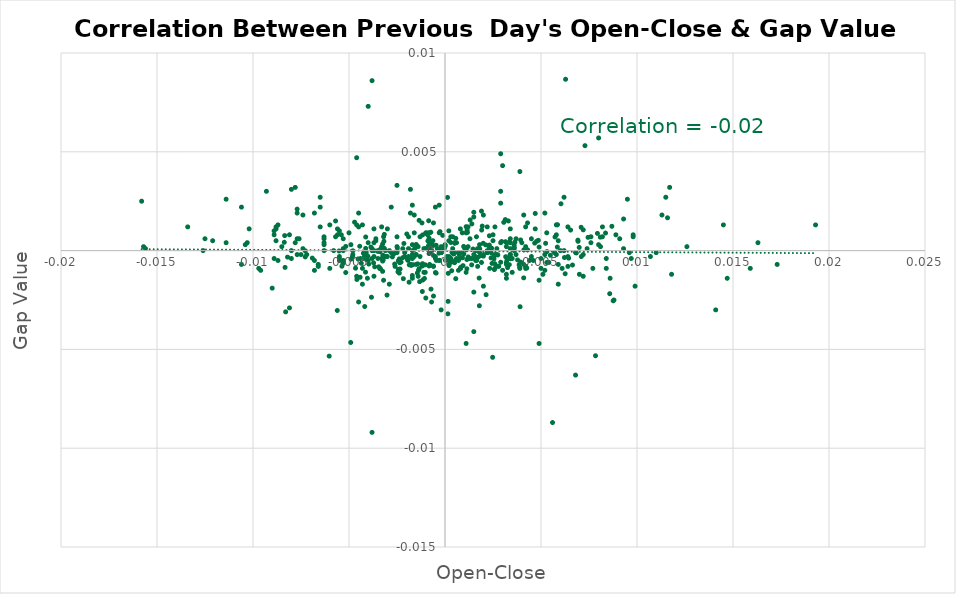
| Category | Series 0 |
|---|---|
| 2.0000000000020002e-05 | 0 |
| -0.004529999999998924 | 0 |
| -0.0015200000000000768 | 0 |
| 0.00034999999999896225 | -0.001 |
| 0.006839999999999957 | 0 |
| 0.0017099999999999893 | 0 |
| 0.008090000000000042 | 0.001 |
| -0.008329999999999949 | -0.001 |
| 0.0009799999999999809 | 0 |
| -0.0008599999999999719 | 0 |
| -0.0019399999999989426 | 0 |
| 0.0009700000000000264 | 0 |
| 0.004769999999999941 | 0 |
| 0.0010999999999999899 | 0.001 |
| -0.005369999999999986 | -0.001 |
| -0.003249999999998976 | 0 |
| 0.0042999999999999705 | 0 |
| -0.003249999999999975 | -0.001 |
| -0.00046000000000001595 | 0 |
| 0.004669999999999952 | 0 |
| 0.006919999999999926 | 0.001 |
| -0.0046599999999999975 | -0.001 |
| 0.003390000000000004 | 0 |
| 0.0025800000000000267 | 0 |
| -0.0006099999999999994 | 0 |
| -0.00011999999999889877 | 0.001 |
| 0.0010299999999999754 | 0 |
| -0.0008500000000000174 | 0.002 |
| -0.005319999999999991 | -0.001 |
| -0.0030200000000000227 | -0.002 |
| -0.004250000000001086 | 0 |
| -0.0011700000000000044 | -0.001 |
| -0.0024300000000000432 | -0.001 |
| 0.0049000000000000155 | 0 |
| -0.0026199999999999557 | -0.001 |
| -0.0007099999999999884 | 0 |
| -0.003449999999999953 | -0.001 |
| -0.0008299999999999974 | 0 |
| -0.004039999999998933 | -0.001 |
| -0.00383 | -0.002 |
| 0.0014999999999999458 | 0.002 |
| -0.0041400000000000325 | -0.001 |
| -0.0004999999999999449 | -0.001 |
| 0.001849999999998908 | 0 |
| -0.0008400000000000629 | 0 |
| 0.0017300000000000093 | 0 |
| 0.0040999999999999925 | -0.001 |
| -0.0008299999999999974 | 0 |
| 0.002950000000000008 | 0 |
| -0.0010299999999999754 | -0.001 |
| 0.007090000000000041 | 0.001 |
| -0.0016999999999999238 | -0.001 |
| -0.002429999999999932 | -0.001 |
| -0.0033599999999989194 | -0.001 |
| 0.001540000000001096 | 0 |
| -0.004890000000000061 | 0 |
| 0.003939999999998944 | 0.001 |
| -0.0044399999999999995 | 0 |
| 0.00048000000000003595 | 0 |
| -0.0034999999999999476 | 0 |
| -0.0048000000000000265 | 0 |
| 0.0048599999999999755 | 0.001 |
| 0.00653999999999999 | 0.001 |
| -0.0011900000000000244 | -0.001 |
| 0.0011700000000000044 | 0.001 |
| 0.00031999999999998696 | -0.001 |
| -0.0013400000000000079 | -0.001 |
| -0.00835000000000008 | 0.001 |
| -0.007279999999999953 | 0 |
| 0.0023299999999999432 | 0 |
| -0.0008099999999999774 | 0 |
| 0.0011099999999999444 | 0 |
| 0.0019400000000000528 | 0.001 |
| 0.003610000000000002 | 0 |
| 0.0025500000000000522 | 0 |
| 0.003149999999999986 | 0 |
| 0.0008099999999999774 | 0 |
| -0.0031599999999989414 | 0.001 |
| 0.01158999999999999 | 0.002 |
| 0.0025900000000000922 | -0.001 |
| -0.00490999999999997 | -0.005 |
| 0.007839999999999958 | -0.005 |
| 0.0021400000000000308 | -0.002 |
| 0.005859999999999976 | 0.001 |
| -0.003660000000001107 | -0.001 |
| -0.0032200000000000006 | 0 |
| 0.005240000000000022 | 0 |
| -0.0023800000000000487 | -0.001 |
| -0.003249999999999975 | -0.001 |
| 0.00020999999999993246 | -0.001 |
| -0.0011600000000000499 | -0.001 |
| 0.006220000000000003 | 0 |
| -0.005170000000001007 | -0.001 |
| -0.0013800000000000479 | -0.001 |
| -0.0031799999999999606 | 0 |
| -0.0014499999999999513 | 0 |
| -0.004130000000001077 | 0.001 |
| -0.0017600000000000948 | -0.001 |
| -0.0023400000000000087 | -0.001 |
| 0.0014600000000000168 | 0 |
| -0.002569999999999961 | 0 |
| 0.0036399999999999766 | 0 |
| 0.00029999999999996696 | 0 |
| 0.0037800000000000056 | 0 |
| 0.002429999999999932 | 0 |
| 0.0023100000000010334 | 0.001 |
| 0.000160000000000049 | -0.003 |
| -0.0021999999999999797 | 0 |
| -0.003390000000000004 | 0 |
| 0.00875999999999999 | -0.003 |
| -0.0022900000000000142 | -0.001 |
| 0.0021200000000000108 | 0 |
| 0.007940000000000058 | 0.001 |
| -0.00266999999999995 | 0 |
| -0.000260000000000038 | 0.001 |
| 0.00600999999999996 | 0 |
| -0.006909999999999972 | 0 |
| 0.00012999999999996348 | 0.003 |
| 0.005310000000000037 | 0 |
| -0.0048200000000000465 | 0 |
| 0.0031399999999989214 | 0.002 |
| 0.006990000000000052 | 0 |
| 0.0016100000000001113 | 0 |
| -0.001180000000000181 | -0.001 |
| 0.0032600000000000406 | -0.001 |
| 0.0023299999999999432 | -0.001 |
| 0.00031999999999987594 | -0.001 |
| 0.001140000000000141 | -0.001 |
| 0.0005199999999998539 | -0.001 |
| -0.0008299999999998864 | -0.001 |
| -0.00045000000000106066 | -0.001 |
| -0.0011700000000000044 | 0.001 |
| 0.0018100000000000893 | 0 |
| 0.003230000000000066 | 0 |
| -0.0010700000000000154 | -0.001 |
| 0.00017000000000000348 | -0.001 |
| -0.00028999999999990145 | 0 |
| 0.0020000000000000018 | 0 |
| -0.0021700000000000053 | -0.001 |
| 0.0028999999999999027 | -0.001 |
| -0.0014399999999999968 | -0.001 |
| 0.0005099999999989002 | 0 |
| 0.00043999999999999595 | 0 |
| 0.0038599999999999746 | -0.001 |
| -0.007280000000000064 | 0 |
| -0.0041800000000000725 | -0.003 |
| 0.0019900000000000473 | 0 |
| -0.0040200000000000236 | 0 |
| -0.0023999999999999577 | -0.001 |
| 0.006440000000000001 | 0 |
| 0.0004999999999999449 | -0.001 |
| -0.000600000000000156 | 0 |
| 0.00275000000000003 | 0 |
| -0.00046000000000001595 | -0.001 |
| -0.0018699999999999273 | -0.002 |
| -0.00029999999999996696 | 0 |
| -0.0044199999999999795 | -0.001 |
| 0.0011499999999999844 | 0.001 |
| -0.0015800000000000258 | 0 |
| -0.003970000000000029 | -0.001 |
| 0.0005600000000000049 | 0.001 |
| 0.0025700000000010714 | -0.001 |
| 0.0013900000000000023 | -0.001 |
| -0.0016700000000000603 | -0.001 |
| 0.0011399999999999189 | 0 |
| -0.0006099999999999994 | -0.001 |
| 0.006639999999999979 | -0.001 |
| 0.0007500000000000284 | 0 |
| 0.003350000000000075 | -0.001 |
| 0.007449999999999957 | 0.001 |
| 0.004109999999999947 | 0 |
| -0.0007300000000000084 | -0.002 |
| -0.004589999999999983 | -0.001 |
| -0.0021399999999999197 | 0 |
| 0.0014000000000000679 | 0.001 |
| 0.003889999999999949 | -0.001 |
| 0.0024500000000000632 | -0.001 |
| -0.0024799999999999267 | 0 |
| 0.0012099999999999334 | 0 |
| -0.003489999999999993 | 0 |
| 0.00036000000000002697 | 0 |
| 0.0042600000000000415 | -0.001 |
| 0.00268999999999997 | -0.001 |
| 0.00164999999999893 | -0.001 |
| -0.0006300000000000194 | 0.001 |
| -0.00031000000000003247 | 0 |
| 0.003909999999999969 | -0.003 |
| -0.0032399999999989104 | 0 |
| -0.005170000000000008 | 0 |
| -0.0033600000000000296 | 0 |
| -0.004709999999999992 | 0.001 |
| 0.006929999999999992 | 0 |
| -0.005609999999998894 | -0.003 |
| 0.008360000000000034 | 0.001 |
| -0.0008899999999999464 | 0 |
| -0.0013199999999999878 | -0.002 |
| 0.0016399999999999748 | 0.001 |
| 0.007289999999999908 | 0.005 |
| 0.0024000000000000687 | 0 |
| 0.005489999999999995 | 0 |
| -0.002360000000001028 | -0.001 |
| -0.0011799999999998478 | -0.002 |
| -3.999999999992898e-05 | 0 |
| -0.008369999999999989 | 0 |
| 0.0009099999999999664 | 0 |
| 0.0007499999999999174 | 0 |
| 0.0023099999999999232 | 0 |
| 0.0013099999999999223 | 0.002 |
| 0.0030600000000000627 | 0.001 |
| 0.006039999999999934 | 0.002 |
| -0.00602999999999998 | -0.005 |
| 0.008579999999998922 | -0.002 |
| -0.0023800000000000487 | 0 |
| 0.00041999999999997595 | 0 |
| -0.0043600000000000305 | -0.001 |
| -0.003860000000001085 | 0 |
| 0.005409999999998916 | -0.001 |
| 0.0031599999999999406 | 0 |
| -0.0037199999999999456 | -0.001 |
| -0.0027399999999999647 | 0 |
| 0.0025399999999999867 | 0 |
| 0.0009399999999999409 | -0.001 |
| -0.0024500000000000632 | -0.001 |
| 0.008689999999999976 | 0.001 |
| -0.001989999999998937 | 0.001 |
| 0.007199999999998985 | 0.001 |
| 0.006259999999999932 | -0.001 |
| -0.0009000000000000119 | 0.001 |
| -0.0010299999999999754 | -0.001 |
| 0.0024800000000000377 | -0.005 |
| 0.000560000000000116 | -0.001 |
| -0.004129999999999967 | 0 |
| -0.0018600000000001948 | -0.001 |
| 0.0017899999999999583 | -0.003 |
| -0.0019500000000000073 | 0 |
| 0.0008300000000001084 | -0.001 |
| 0.005730000000000013 | 0.001 |
| -0.0019200000000001438 | 0 |
| -0.005519999999999969 | 0 |
| -0.001000000000000112 | 0.001 |
| 0.00021000000000004349 | 0 |
| 0.00014999999999998348 | -0.003 |
| 0.0039399999999998325 | -0.001 |
| 0.0019099999999998563 | 0.001 |
| -0.008199999999999985 | 0 |
| 0.0046999999999999265 | 0.002 |
| -0.0014199999999999768 | -0.001 |
| 0.003409999999999913 | 0 |
| -0.0008299999999998864 | 0.001 |
| 9.999999999843467e-06 | 0 |
| 0.0017799999999998928 | -0.001 |
| -0.0031600000000000517 | 0 |
| -0.0013500000000000734 | 0.002 |
| 0.006279999999999952 | 0.009 |
| 0.005850000000000022 | 0 |
| -0.0007400000000000739 | 0.001 |
| -0.004149999999999987 | 0 |
| 0.003349999999999964 | 0 |
| -0.005299999999999971 | 0 |
| -0.0015999999999999348 | 0 |
| -0.008499999999999952 | 0 |
| -0.0029999999999988924 | 0 |
| -0.00019999999999997797 | 0 |
| -0.010399999999999965 | 0 |
| -0.006000000000000005 | 0.001 |
| 0.0006999999999989237 | -0.001 |
| -0.006800000000000028 | -0.001 |
| 0.01100000000000001 | 0 |
| -0.0009000000000000119 | 0.001 |
| -0.0014999999999999458 | 0 |
| -0.0045999999999999375 | -0.001 |
| 0.0033999999999999586 | 0.001 |
| -0.015799999999999925 | 0.003 |
| 0.005199999999999982 | 0.002 |
| 0.0003000000000010772 | 0 |
| 0.014499999999999957 | 0.001 |
| -0.00550000000000006 | -0.001 |
| 0.00040000000000006697 | 0.001 |
| -0.005300000000000082 | -0.001 |
| -0.0048000000000000265 | 0 |
| 0.006999999999998896 | -0.001 |
| -0.0036000000000000476 | 0.001 |
| -0.0010000000000000009 | -0.002 |
| 0.0019000000000000128 | -0.001 |
| 0.0037000000000000366 | 0.001 |
| -0.0017999999999989136 | -0.001 |
| -0.0024999999999999467 | 0 |
| 0.0022999999999999687 | 0 |
| -0.0010000000000000009 | 0 |
| -0.006500000000000061 | 0.001 |
| 0.0033999999999999586 | 0 |
| -0.0045000000000000595 | 0.001 |
| 0.0021999999999999797 | 0.001 |
| -0.009599999999999831 | -0.001 |
| -0.008899999999999908 | 0 |
| 0.0031999999999998696 | -0.001 |
| -0.0015000000000000568 | 0 |
| -0.0038000000000010248 | 0.009 |
| 0.0037000000000000366 | 0 |
| 0.0041999999999999815 | 0.001 |
| 0.005299999999999971 | 0.001 |
| -0.0030000000000000027 | 0.001 |
| -0.006299999999999972 | 0 |
| -0.005600000000000049 | 0.001 |
| -0.005600000000000049 | 0.001 |
| -0.010600000000000054 | -0.001 |
| 0.0014999999999999458 | -0.002 |
| -0.005700000000000038 | 0.001 |
| -0.0033999999999999586 | -0.001 |
| 0.0050000000000000044 | 0 |
| 0.005699999999999927 | 0 |
| -0.0038000000000000256 | 0 |
| -0.00880000000000003 | 0.001 |
| 0.0041999999999999815 | 0 |
| 0.0006999999999999229 | -0.001 |
| 0.0033999999999989594 | 0 |
| 0.012599999999999945 | 0 |
| 0.0 | 0 |
| -0.0029000000000000137 | -0.002 |
| 0.0043000000000000815 | 0.001 |
| -0.0038000000000000256 | 0 |
| -0.0041999999999999815 | 0 |
| 0.009499999999999953 | 0.003 |
| 0.0029000000000000137 | 0.003 |
| 0.0028999999999999027 | 0.005 |
| 0.0031999999999999806 | -0.001 |
| 0.0040999999999999925 | 0.002 |
| -0.005800000000000027 | 0 |
| 0.0035999999999999366 | 0 |
| -0.006299999999999972 | 0.001 |
| -0.0036999999999999256 | 0 |
| -0.010299999999999976 | 0 |
| -0.0005999999999999339 | 0.001 |
| 0.0008000000000000229 | 0.001 |
| 0.0039000000000000146 | -0.001 |
| -0.0017999999999999128 | 0.002 |
| 0.007200000000000095 | 0 |
| 0.0018000000000000238 | 0 |
| 0.014700000000001046 | -0.001 |
| -0.0024000000000001798 | -0.001 |
| -0.0121 | 0 |
| -0.0012999999999999678 | 0 |
| 0.011700000000000044 | 0.003 |
| -0.0015000000000000568 | -0.001 |
| -0.00550000000000006 | 0 |
| 0.0030000000000000027 | 0.004 |
| -0.009700000000000042 | -0.001 |
| -0.0032999999999999696 | 0.001 |
| 0.0041999999999999815 | -0.001 |
| -0.004000000000000115 | 0.007 |
| -0.0033000000000000806 | 0 |
| -0.0040999999999999925 | 0 |
| 0.0040999999999999925 | -0.001 |
| -0.007400000000000073 | 0 |
| -0.0016000000000000458 | 0.001 |
| -0.011399999999999966 | 0.003 |
| 0.0044000000000000705 | 0 |
| 0.007199999999999984 | -0.001 |
| -0.006800000000000028 | 0.002 |
| 0.0021999999999999797 | 0 |
| -0.0036000000000000476 | 0 |
| -0.002800000000001024 | 0 |
| -0.013399999999999967 | 0.001 |
| -0.0049000000000000155 | 0 |
| -0.007199999999999984 | 0 |
| 0.0025999999999999357 | -0.001 |
| 0.0007000000000010331 | 0 |
| -0.0031999999999999806 | 0.001 |
| -0.0024999999999999467 | 0.003 |
| 0.0040000000000000036 | 0 |
| 0.0033999999999999586 | 0 |
| 0.0031999999999999806 | 0 |
| -0.0020999999999999908 | 0 |
| -0.0008000000000000229 | -0.001 |
| 0.00039999999999995595 | 0 |
| -0.0010999999999999899 | 0 |
| 0.002700000000001035 | 0 |
| -0.0008000000000000229 | 0 |
| -0.0017000000000000348 | 0 |
| -0.0020999999999999908 | 0 |
| 0.0023999999999999577 | 0 |
| -0.0013999999999999568 | 0 |
| -0.0016999999999999238 | 0 |
| -0.006299999999999972 | 0 |
| 0.0012999999999999678 | 0 |
| 0.000200000000000089 | -0.001 |
| -0.0004999999999999449 | 0 |
| 0.00019999999999997797 | 0.001 |
| -0.0007000000000000339 | 0 |
| -0.000200000000000089 | 0 |
| 0.0005999999999999339 | 0 |
| 0.0025000000000000577 | 0.001 |
| 0.0021999999999999797 | 0 |
| 0.008599999999999941 | -0.001 |
| 0.0015999999999999348 | -0.001 |
| 0.0008000000000000229 | -0.001 |
| 0.0029000000000000137 | 0 |
| -0.0037000000000000366 | 0 |
| 0.0033999999999999586 | 0 |
| -0.005400000000000071 | 0.001 |
| 0.0046000000000000485 | 0 |
| -0.006000000000000005 | -0.001 |
| 0.0050000000000000044 | -0.001 |
| 0.0020000000000000018 | 0 |
| 0.0 | 0 |
| 0.0044999999999999485 | 0 |
| -0.00019999999999997797 | 0 |
| 0.006800000000000028 | 0 |
| 0.0016000000000000458 | 0 |
| -0.0050000000000000044 | 0.001 |
| -0.005299999999999971 | 0 |
| -0.000300000000000078 | -0.001 |
| 0.0007000000000010331 | 0 |
| -0.0005999999999999339 | -0.002 |
| -0.008000000000000007 | 0 |
| 0.0045000000000000595 | 0.001 |
| 0.00019999999999997797 | -0.001 |
| 0.0010999999999999899 | -0.005 |
| 0.00759999999999994 | 0.001 |
| 0.0014999999999989466 | 0.002 |
| 0.0017000000000000348 | -0.001 |
| -0.000500000000000056 | 0 |
| -0.0021999999999999797 | 0 |
| 0.007099999999999995 | 0 |
| 0.0017000000000000348 | 0 |
| 0.0031999999999999806 | 0 |
| 9.999999999998899e-05 | 0 |
| -0.007700000000001039 | 0.002 |
| 0.00039999999999995595 | 0 |
| -0.007400000000001072 | 0.002 |
| 0.0010999999999999899 | 0.001 |
| -0.005499999999999949 | 0.001 |
| -0.0016999999999999238 | 0.002 |
| 0.00759999999999994 | 0 |
| -0.008100000000001106 | -0.003 |
| -0.00869999999999993 | 0.001 |
| -0.000200000000000089 | 0 |
| 0.0020000000000000018 | -0.002 |
| -0.0010999999999999899 | -0.001 |
| 0.0035999999999999366 | 0 |
| 0.005299999999999971 | -0.001 |
| 0.00019999999999997797 | 0 |
| 0.005900000000000016 | 0 |
| 0.008000000000000007 | 0.006 |
| -0.008900000000000019 | 0.001 |
| -0.00659999999999894 | -0.001 |
| 0.0011999999999999789 | 0.001 |
| -0.00029999999999996696 | 0.001 |
| 0.0011999999999999789 | 0 |
| 0.0025000000000000577 | 0.001 |
| 0.0025999999999999357 | 0.001 |
| -0.0012999999999999678 | 0.001 |
| 0.0006000000000000449 | 0 |
| 0.0027000000000000357 | 0 |
| -0.00019999999999997797 | 0 |
| -0.0037000000000000366 | 0.001 |
| 0.006099999999999994 | -0.001 |
| -0.0016000000000000458 | 0.002 |
| -0.0006000000000000449 | -0.001 |
| 0.007400000000000073 | 0 |
| -0.00330000000000108 | 0 |
| -0.0025000000000000577 | 0 |
| -0.008900000000000019 | 0.001 |
| 0.00029999999999996696 | 0.001 |
| -0.0038000000000000256 | 0 |
| 0.0013999999999999568 | 0 |
| 0.0012999999999999678 | 0.001 |
| -0.0024999999999999467 | 0.001 |
| -0.00019999999999997797 | 0 |
| 0.008400000000000074 | 0 |
| 0.009600000000000053 | 0 |
| 0.005800000000000027 | 0 |
| -0.0040000000000000036 | 0 |
| -0.0019000000000000128 | 0 |
| -0.0010000000000000009 | 0 |
| 0.015900000000000025 | -0.001 |
| 0.0032999999999999696 | 0.001 |
| -0.009300000000001085 | 0.003 |
| 0.004900000000001015 | -0.001 |
| -0.00770000000000004 | 0.002 |
| 0.017299999999998983 | -0.001 |
| 0.0020000000000000018 | 0.002 |
| 0.0014999999999989466 | -0.004 |
| -0.0038000000000000256 | -0.009 |
| 0.005800000000000027 | 0.001 |
| -0.00019999999999997797 | -0.003 |
| 0.006399999999999961 | 0.001 |
| -0.0010000000000000009 | 0.001 |
| -0.0046000000000000485 | 0.005 |
| 0.0047000000000000375 | 0.001 |
| 0.006199999999999983 | 0.003 |
| -0.008099999999999996 | 0.001 |
| 0.0034000000000000696 | 0 |
| 0.0034999999999999476 | -0.001 |
| 0.005199999999999982 | 0 |
| 0.008000000000000007 | 0 |
| -0.010199999999999987 | 0.001 |
| -0.00879999999999892 | 0.001 |
| 0.005099999999999993 | -0.001 |
| -0.0007000000000000339 | -0.003 |
| -0.0042999999999999705 | -0.002 |
| -0.00029999999999896776 | 0.002 |
| 0.009699999999999931 | 0 |
| -0.0018000000000000238 | 0.003 |
| -0.007800000000000029 | 0.003 |
| -0.0027999999999989145 | 0.002 |
| 0.0015000000000000568 | 0 |
| -0.0009000000000000119 | 0.001 |
| 0.0036000000000000476 | 0 |
| 0.0029000000000000137 | 0.002 |
| -0.00550000000000006 | 0 |
| -0.009000000000000008 | -0.002 |
| 0.005800000000000027 | 0.001 |
| 0.005899999999998906 | -0.002 |
| -0.00649999999999995 | 0.003 |
| -0.0030999999999999917 | 0 |
| 0.011499999999999955 | 0.003 |
| 0.008900000000000019 | 0.001 |
| -0.00770000000000004 | 0 |
| -0.010599999999999943 | 0.002 |
| 0.002600000000001046 | 0 |
| -0.005699999999999927 | 0.002 |
| -0.008799999999999919 | 0.001 |
| 0.006199999999999983 | 0 |
| -0.012500000000000067 | 0.001 |
| 0.009800000000000031 | 0.001 |
| -0.015600000000000058 | 0 |
| -0.0017000000000000348 | 0 |
| 0.01629999999999998 | 0 |
| -0.0019000000000000128 | 0.001 |
| -0.0008000000000000229 | 0.001 |
| 0.009299999999999975 | 0.002 |
| -0.005300000000000082 | 0.001 |
| 0.005900000000000016 | -0.001 |
| 0.0019000000000000128 | 0.002 |
| -0.001500000000001056 | 0 |
| 0.009099999999999997 | 0.001 |
| 0.014100000000000001 | -0.003 |
| 0.0033999999999989594 | 0.001 |
| -0.00759999999999994 | 0.001 |
| -0.007800000000000029 | 0 |
| 0.008099999999999996 | 0 |
| 0.00029999999999996696 | 0 |
| 0.0004999999999999449 | 0 |
| 0.009800000000000031 | 0.001 |
| -0.0034999999999999476 | 0 |
| -0.011399999999999966 | 0 |
| -0.0008000000000000229 | 0 |
| 0.0021999999999999797 | 0 |
| 0.008199999999999985 | 0.001 |
| -0.0030999999999999917 | 0 |
| 0.005199999999999982 | -0.001 |
| -0.0042999999999999705 | 0.001 |
| -0.008000000000000007 | 0.003 |
| 0.0042000000000000925 | -0.001 |
| 0.00880000000000003 | -0.002 |
| 0.0008000000000010221 | -0.001 |
| -0.0011999999999999789 | 0.001 |
| 0.0009000000000000119 | 0.001 |
| -0.0042999999999999705 | -0.001 |
| -0.0037000000000000366 | 0 |
| 0.0039000000000010138 | 0.004 |
| 0.019299999999999984 | 0.001 |
| -0.0025999999999999357 | -0.001 |
| 0.0031999999999999806 | -0.001 |
| -0.004500000000001059 | -0.003 |
| -0.000500000000000056 | 0.002 |
| 0.0018000000000000238 | 0 |
| -0.008300000000001084 | -0.003 |
| -0.0031999999999999806 | -0.001 |
| 0.0034999999999989484 | 0 |
| 0.008399999999999963 | -0.001 |
| 0.0031999999999999806 | -0.001 |
| 0.006399999999999961 | 0 |
| -0.0043999999999999595 | 0 |
| -0.0028999999999999027 | 0 |
| -0.0037000000000000366 | -0.001 |
| -0.0019000000000000128 | 0 |
| -0.0017000000000000348 | -0.001 |
| 0.00770000000000004 | -0.001 |
| -0.0014000000000000679 | -0.001 |
| -0.012599999999999945 | 0 |
| -0.008000000000000007 | 0 |
| -0.007500000000000062 | 0 |
| -0.0017000000000000348 | 0 |
| 0.009299999999999864 | 0 |
| 0.0027999999999999137 | -0.001 |
| -0.006799999999999917 | 0 |
| -0.00770000000000004 | 0.001 |
| -0.006599999999999939 | -0.001 |
| -0.00039999999999995595 | 0 |
| -0.015700000000000047 | 0 |
| 0.005600000000000049 | -0.009 |
| 0.0049000000000001265 | -0.005 |
| 0.011299999999999866 | 0.002 |
| -0.0044999999999999485 | 0.002 |
| 0.006400000000000183 | -0.001 |
| -0.006299999999999972 | 0.001 |
| 0.006800000000000139 | -0.006 |
| -0.0040000000000000036 | 0 |
| 0.010699999999999932 | 0 |
| 0.0029999999999998916 | -0.001 |
| 0.008199999999999985 | 0.001 |
| 0.011800000000000033 | -0.001 |
| -0.0045999999999999375 | 0.001 |
| -0.00649999999999995 | 0.002 |
| -0.00869999999999993 | 0 |
| 0.001100000000000101 | -0.001 |
| -0.006299999999999972 | 0 |
| 0.00990000000000002 | -0.002 |